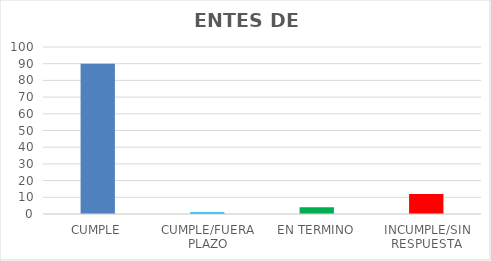
| Category | TOTAL |
|---|---|
| CUMPLE | 90 |
| CUMPLE/FUERA PLAZO | 1 |
| EN TERMINO | 4 |
| INCUMPLE/SIN RESPUESTA | 12 |